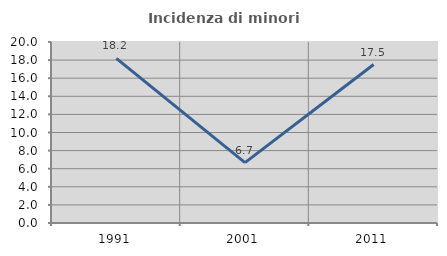
| Category | Incidenza di minori stranieri |
|---|---|
| 1991.0 | 18.182 |
| 2001.0 | 6.667 |
| 2011.0 | 17.512 |